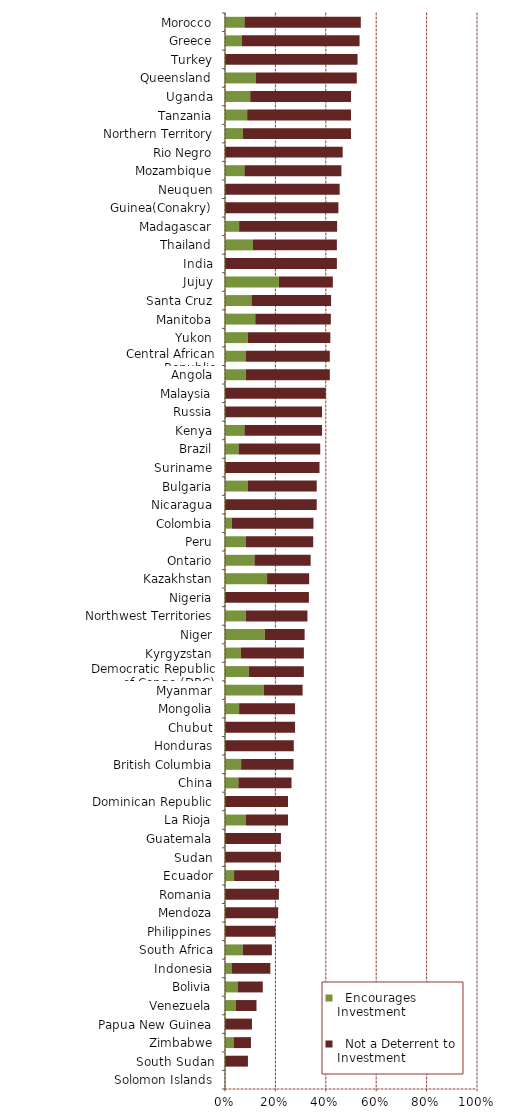
| Category |   Encourages Investment |   Not a Deterrent to Investment |
|---|---|---|
| Solomon Islands | 0 | 0 |
| South Sudan | 0 | 0.091 |
| Zimbabwe | 0.034 | 0.069 |
| Papua New Guinea | 0 | 0.107 |
| Venezuela | 0.042 | 0.083 |
| Bolivia | 0.05 | 0.1 |
| Indonesia | 0.026 | 0.154 |
| South Africa | 0.07 | 0.116 |
| Philippines | 0 | 0.2 |
| Mendoza | 0 | 0.211 |
| Romania | 0 | 0.214 |
| Ecuador | 0.036 | 0.179 |
| Sudan | 0 | 0.222 |
| Guatemala | 0 | 0.222 |
| La Rioja | 0.083 | 0.167 |
| Dominican Republic | 0 | 0.25 |
| China | 0.053 | 0.211 |
| British Columbia | 0.064 | 0.208 |
| Honduras | 0 | 0.273 |
| Chubut | 0 | 0.278 |
| Mongolia | 0.056 | 0.222 |
| Myanmar | 0.154 | 0.154 |
| Democratic Republic of Congo (DRC) | 0.094 | 0.219 |
| Kyrgyzstan | 0.063 | 0.25 |
| Niger | 0.158 | 0.158 |
| Northwest Territories | 0.082 | 0.245 |
| Nigeria | 0 | 0.333 |
| Kazakhstan | 0.167 | 0.167 |
| Ontario | 0.117 | 0.223 |
| Peru | 0.083 | 0.267 |
| Colombia | 0.027 | 0.324 |
| Nicaragua | 0 | 0.364 |
| Bulgaria | 0.091 | 0.273 |
| Suriname | 0 | 0.375 |
| Brazil | 0.054 | 0.324 |
| Kenya | 0.077 | 0.308 |
| Russia | 0 | 0.385 |
| Malaysia | 0 | 0.4 |
| Angola | 0.083 | 0.333 |
| Central African Republic | 0.083 | 0.333 |
| Yukon | 0.09 | 0.328 |
| Manitoba | 0.12 | 0.3 |
| Santa Cruz | 0.105 | 0.316 |
| Jujuy | 0.214 | 0.214 |
| India | 0 | 0.444 |
| Thailand | 0.111 | 0.333 |
| Madagascar | 0.056 | 0.389 |
| Guinea(Conakry) | 0 | 0.45 |
| Neuquen | 0 | 0.455 |
| Mozambique | 0.077 | 0.385 |
| Rio Negro | 0 | 0.467 |
| Northern Territory | 0.071 | 0.429 |
| Tanzania | 0.088 | 0.412 |
| Uganda | 0.1 | 0.4 |
| Queensland | 0.123 | 0.4 |
| Turkey | 0 | 0.526 |
| Greece | 0.067 | 0.467 |
| Morocco | 0.077 | 0.462 |